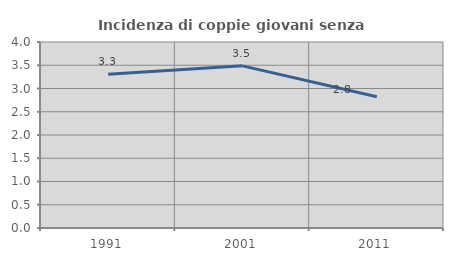
| Category | Incidenza di coppie giovani senza figli |
|---|---|
| 1991.0 | 3.304 |
| 2001.0 | 3.487 |
| 2011.0 | 2.822 |